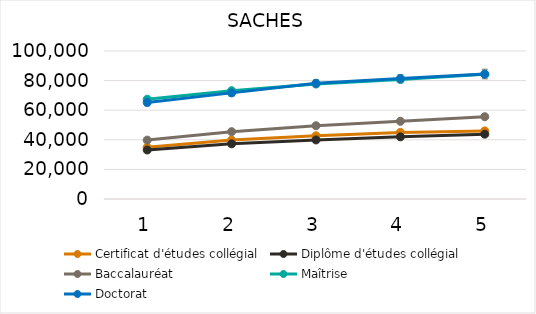
| Category | Certificat d'études collégial | Diplôme d'études collégial | Baccalauréat | Maîtrise | Doctorat |
|---|---|---|---|---|---|
| 1.0 | 35000 | 33100 | 39800 | 67400 | 65200 |
| 2.0 | 39800 | 37300 | 45500 | 73200 | 71700 |
| 3.0 | 42700 | 39900 | 49500 | 77700 | 78200 |
| 4.0 | 45000 | 42000 | 52500 | 80700 | 81400 |
| 5.0 | 46000 | 43800 | 55600 | 84300 | 84400 |